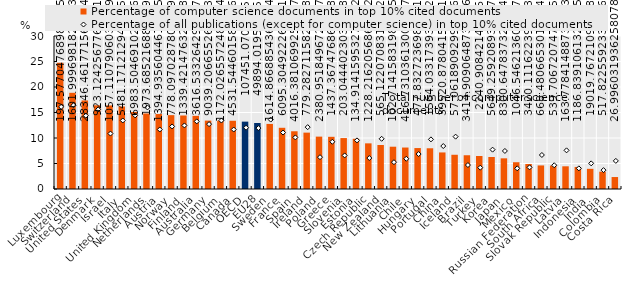
| Category | Percentage of computer science documents in top 10% cited documents |
|---|---|
| Luxembourg | 24.749 |
| Switzerland | 18.862 |
| United States | 17.365 |
| Denmark | 16.412 |
| Israel | 16.384 |
| Italy | 16.18 |
| United Kingdom | 15.094 |
| Netherlands | 14.802 |
| Austria | 14.695 |
| Norway | 14.482 |
| Finland | 14.414 |
| Australia | 14.341 |
| Germany | 13.41 |
| Belgium | 13.384 |
| Canada | 13.379 |
| OECD | 13.209 |
| EU28 | 12.947 |
| Sweden | 12.761 |
| France | 12.002 |
| Spain | 11.321 |
| Ireland | 11.053 |
| Poland | 10.271 |
| Greece | 10.232 |
| Slovenia | 9.987 |
| Estonia | 9.851 |
| Czech Republic | 8.951 |
| New Zealand | 8.629 |
| Lithuania | 8.293 |
| Chile | 8.131 |
| Hungary | 8.027 |
| Portugal | 7.986 |
| China | 7.168 |
| Iceland | 6.712 |
| Brazil | 6.618 |
| Turkey | 6.468 |
| Korea | 6.276 |
| Japan | 6.013 |
| Mexico | 5.248 |
| Russian Federation | 4.901 |
| South Africa | 4.622 |
| Slovak Republic | 4.591 |
| Latvia | 4.45 |
| Indonesia | 4.32 |
| India | 3.954 |
| Colombia | 3.393 |
| Costa Rica | 2.346 |